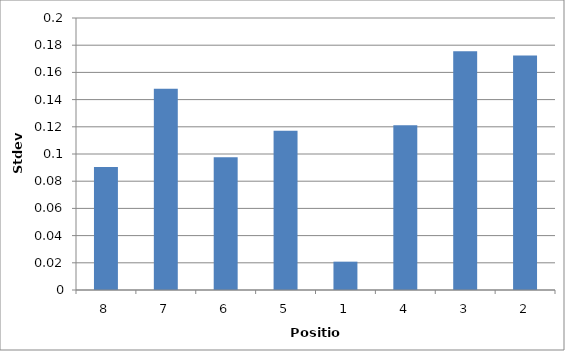
| Category | Series 0 |
|---|---|
| 8.0 | 0.09 |
| 7.0 | 0.148 |
| 6.0 | 0.098 |
| 5.0 | 0.117 |
| 1.0 | 0.021 |
| 4.0 | 0.121 |
| 3.0 | 0.176 |
| 2.0 | 0.172 |